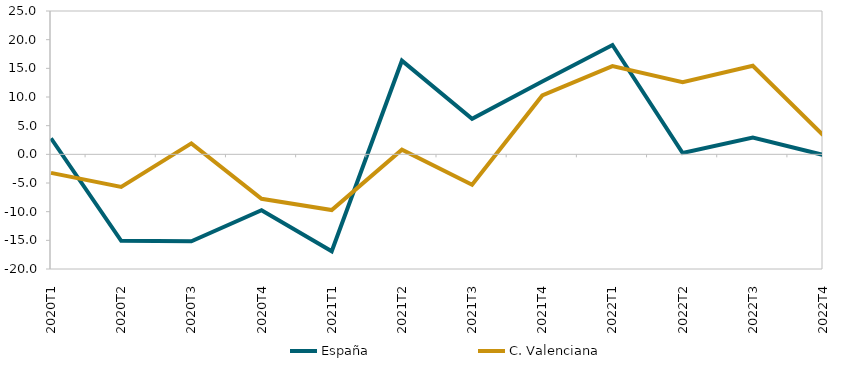
| Category | España | C. Valenciana |
|---|---|---|
| 2020T1 | 2.8 | -3.237 |
| 2020T2 | -15.093 | -5.683 |
| 2020T3 | -15.165 | 1.909 |
| 2020T4 | -9.74 | -7.761 |
| 2021T1 | -16.902 | -9.719 |
| 2021T2 | 16.329 | 0.815 |
| 2021T3 | 6.199 | -5.304 |
| 2021T4 | 12.712 | 10.268 |
| 2022T1 | 19.064 | 15.389 |
| 2022T2 | 0.228 | 12.581 |
| 2022T3 | 2.912 | 15.455 |
| 2022T4 | -0.087 | 3.357 |